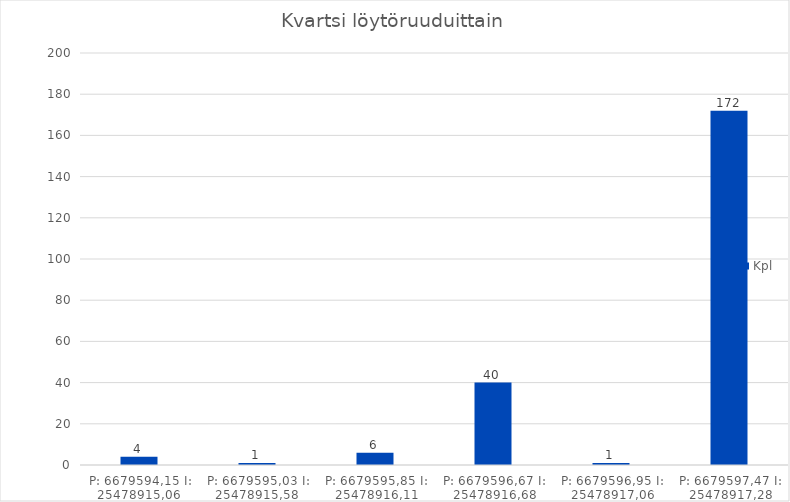
| Category | Kpl |
|---|---|
| P: 6679594,15 I: 25478915,06  | 4 |
| P: 6679595,03 I: 25478915,58  | 1 |
| P: 6679595,85 I: 25478916,11 | 6 |
| P: 6679596,67 I: 25478916,68 | 40 |
| P: 6679596,95 I: 25478917,06 | 1 |
| P: 6679597,47 I: 25478917,28 | 172 |